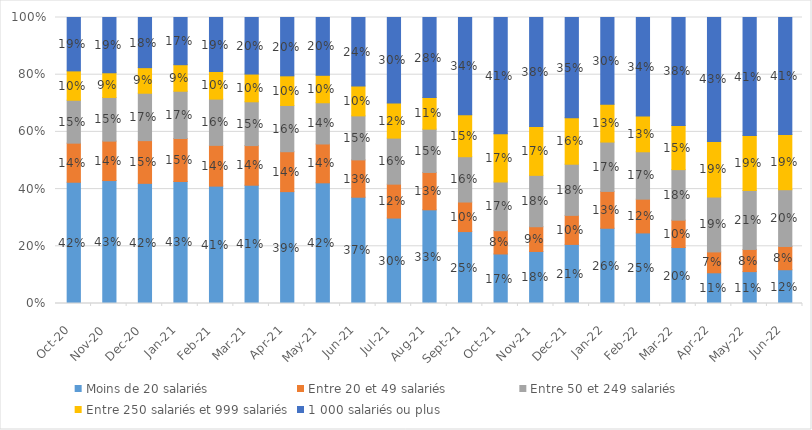
| Category | Moins de 20 salariés | Entre 20 et 49 salariés | Entre 50 et 249 salariés | Entre 250 salariés et 999 salariés | 1 000 salariés ou plus |
|---|---|---|---|---|---|
| 2020-10-01 | 0.424 | 0.137 | 0.15 | 0.103 | 0.187 |
| 2020-11-01 | 0.43 | 0.138 | 0.153 | 0.086 | 0.193 |
| 2020-12-01 | 0.42 | 0.149 | 0.166 | 0.089 | 0.175 |
| 2021-01-01 | 0.427 | 0.15 | 0.165 | 0.093 | 0.165 |
| 2021-02-01 | 0.41 | 0.142 | 0.162 | 0.096 | 0.189 |
| 2021-03-01 | 0.414 | 0.139 | 0.153 | 0.097 | 0.198 |
| 2021-04-01 | 0.391 | 0.14 | 0.162 | 0.104 | 0.204 |
| 2021-05-01 | 0.422 | 0.136 | 0.144 | 0.096 | 0.202 |
| 2021-06-01 | 0.372 | 0.13 | 0.154 | 0.104 | 0.239 |
| 2021-07-01 | 0.299 | 0.119 | 0.161 | 0.123 | 0.299 |
| 2021-08-01 | 0.328 | 0.131 | 0.151 | 0.111 | 0.28 |
| 2021-09-01 | 0.251 | 0.103 | 0.158 | 0.147 | 0.34 |
| 2021-10-01 | 0.173 | 0.081 | 0.17 | 0.169 | 0.406 |
| 2021-11-01 | 0.182 | 0.086 | 0.18 | 0.171 | 0.381 |
| 2021-12-01 | 0.207 | 0.101 | 0.179 | 0.163 | 0.35 |
| 2022-01-01 | 0.263 | 0.129 | 0.173 | 0.132 | 0.303 |
| 2022-02-01 | 0.247 | 0.118 | 0.166 | 0.125 | 0.344 |
| 2022-03-01 | 0.196 | 0.096 | 0.177 | 0.154 | 0.378 |
| 2022-04-01 | 0.107 | 0.073 | 0.192 | 0.194 | 0.433 |
| 2022-05-01 | 0.111 | 0.077 | 0.206 | 0.192 | 0.413 |
| 2022-06-01 | 0.118 | 0.081 | 0.198 | 0.193 | 0.409 |